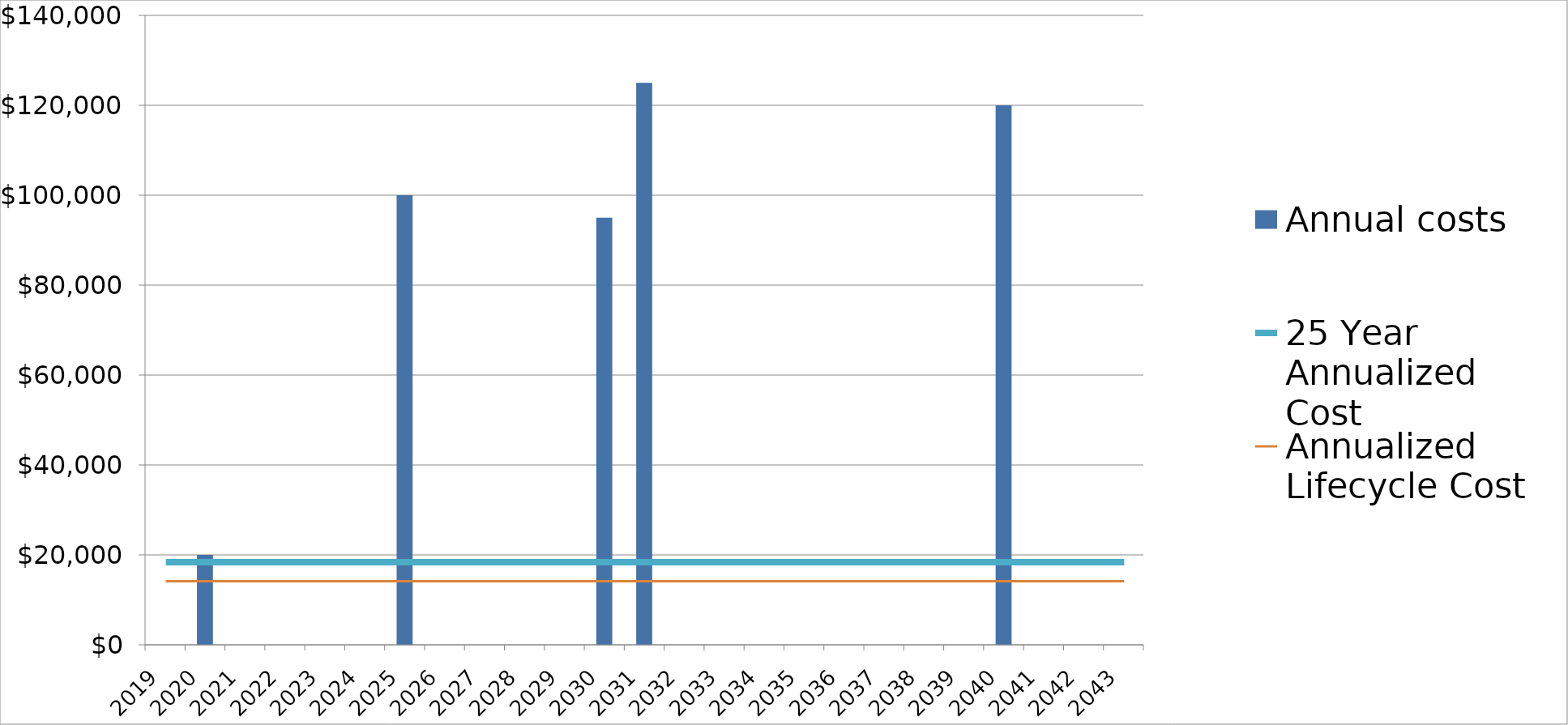
| Category | Annual costs |
|---|---|
| 2019.0 | 0 |
| 2020.0 | 20000 |
| 2021.0 | 0 |
| 2022.0 | 0 |
| 2023.0 | 0 |
| 2024.0 | 0 |
| 2025.0 | 100000 |
| 2026.0 | 0 |
| 2027.0 | 0 |
| 2028.0 | 0 |
| 2029.0 | 0 |
| 2030.0 | 95000 |
| 2031.0 | 125000 |
| 2032.0 | 0 |
| 2033.0 | 0 |
| 2034.0 | 0 |
| 2035.0 | 0 |
| 2036.0 | 0 |
| 2037.0 | 0 |
| 2038.0 | 0 |
| 2039.0 | 0 |
| 2040.0 | 120000 |
| 2041.0 | 0 |
| 2042.0 | 0 |
| 2043.0 | 0 |